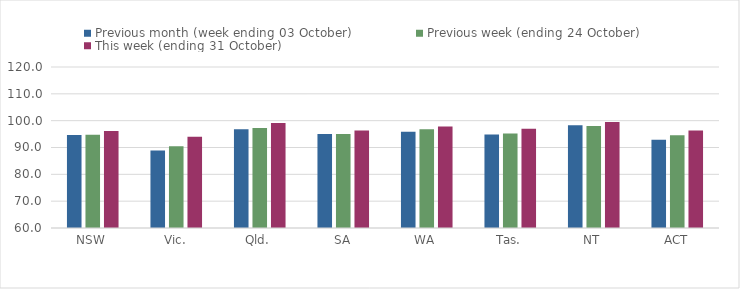
| Category | Previous month (week ending 03 October) | Previous week (ending 24 October) | This week (ending 31 October) |
|---|---|---|---|
| NSW | 94.69 | 94.73 | 96.15 |
| Vic. | 88.89 | 90.5 | 94.04 |
| Qld. | 96.83 | 97.31 | 99.17 |
| SA | 95 | 95.02 | 96.38 |
| WA | 95.87 | 96.82 | 97.82 |
| Tas. | 94.81 | 95.22 | 96.99 |
| NT | 98.3 | 97.97 | 99.53 |
| ACT | 92.87 | 94.58 | 96.34 |